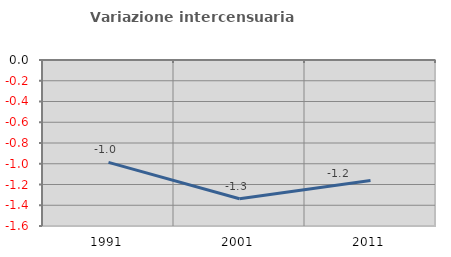
| Category | Variazione intercensuaria annua |
|---|---|
| 1991.0 | -0.987 |
| 2001.0 | -1.337 |
| 2011.0 | -1.161 |